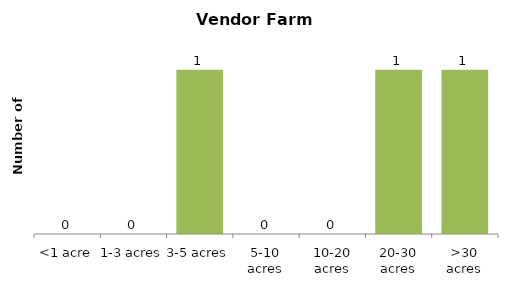
| Category | Series 0 |
|---|---|
| <1 acre | 0 |
| 1-3 acres | 0 |
| 3-5 acres | 1 |
| 5-10 acres | 0 |
| 10-20 acres | 0 |
| 20-30 acres | 1 |
| >30 acres | 1 |